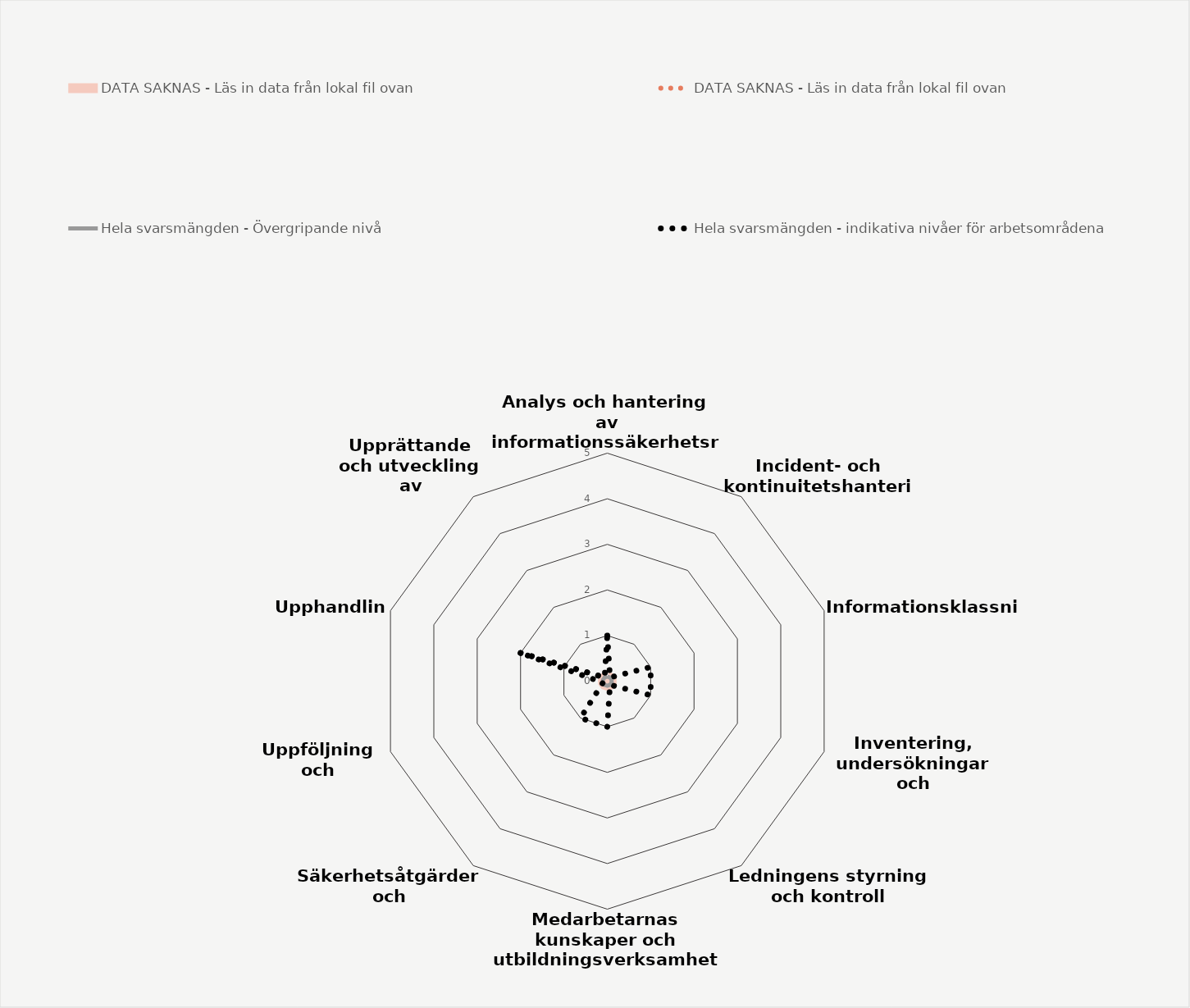
| Category | DATA SAKNAS - Läs in data från lokal fil ovan | Hela svarsmängden - Övergripande nivå | Hela svarsmängden - indikativa nivåer för arbetsområdena |
|---|---|---|---|
| Analys och hantering av informationssäkerhetsrisker | 0 | 0.1 | 1 |
| Incident- och kontinuitetshantering | 0 | 0.1 | 0.1 |
| Informationsklassning | 0 | 0.1 | 1 |
| Inventering, undersökningar och omvärldsbevakning | 0 | 0.1 | 1 |
| Ledningens styrning och kontroll | 0 | 0.1 | 0.1 |
| Medarbetarnas kunskaper och utbildningsverksamhet | 0 | 0.1 | 1 |
| Säkerhetsåtgärder och förbättringsarbete | 0 | 0.1 | 1 |
| Uppföljning och utvärdering | 0 | 0.1 | 0.1 |
| Upphandling | 0 | 0.1 | 2 |
| Upprättande och utveckling av säkerhetskultur | 0 | 0.1 | 0.1 |